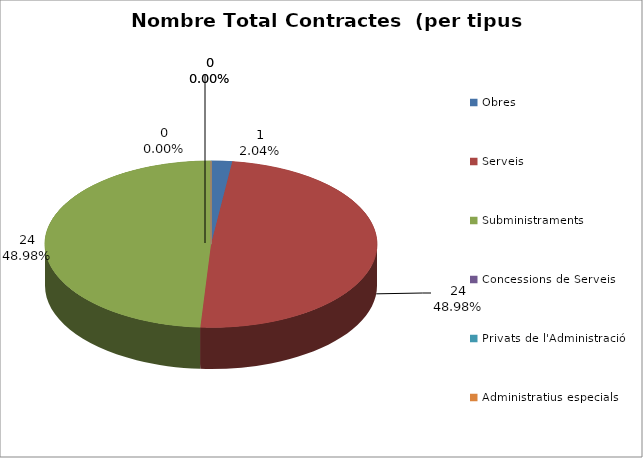
| Category | Nombre Total Contractes |
|---|---|
| Obres | 1 |
| Serveis | 24 |
| Subministraments | 24 |
| Concessions de Serveis | 0 |
| Privats de l'Administració | 0 |
| Administratius especials | 0 |